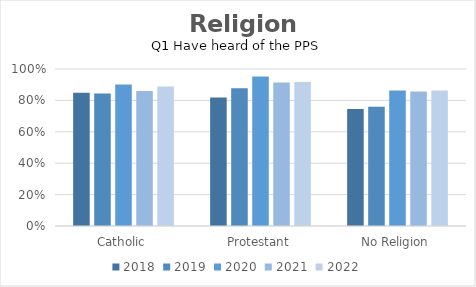
| Category | 2018 | 2019 | 2020 | 2021 | 2022 |
|---|---|---|---|---|---|
| Catholic | 0.849 | 0.844 | 0.901 | 0.86 | 0.888 |
| Protestant | 0.818 | 0.877 | 0.952 | 0.913 | 0.917 |
| No Religion | 0.745 | 0.759 | 0.863 | 0.856 | 0.863 |